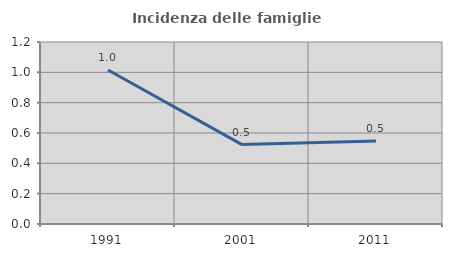
| Category | Incidenza delle famiglie numerose |
|---|---|
| 1991.0 | 1.015 |
| 2001.0 | 0.524 |
| 2011.0 | 0.546 |